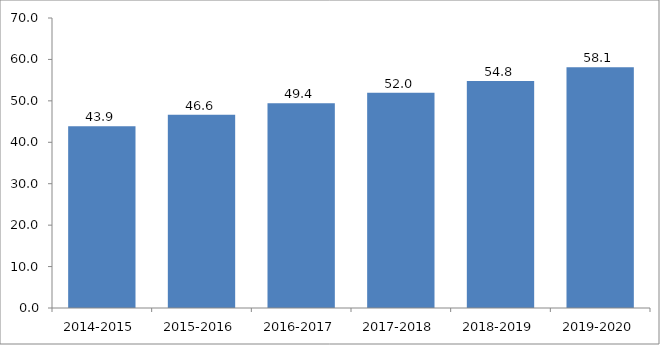
| Category | "A l'heure" (1) |
|---|---|
| 2014-2015 | 43.861 |
| 2015-2016 | 46.622 |
| 2016-2017 | 49.393 |
| 2017-2018 | 51.971 |
| 2018-2019 | 54.786 |
| 2019-2020 | 58.114 |